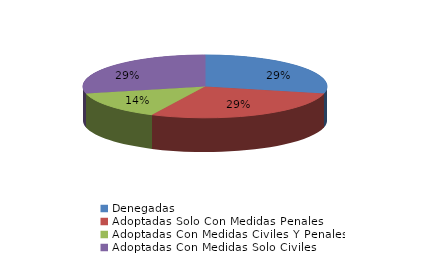
| Category | Series 0 |
|---|---|
| Denegadas | 2 |
| Adoptadas Solo Con Medidas Penales | 2 |
| Adoptadas Con Medidas Civiles Y Penales | 1 |
| Adoptadas Con Medidas Solo Civiles | 2 |